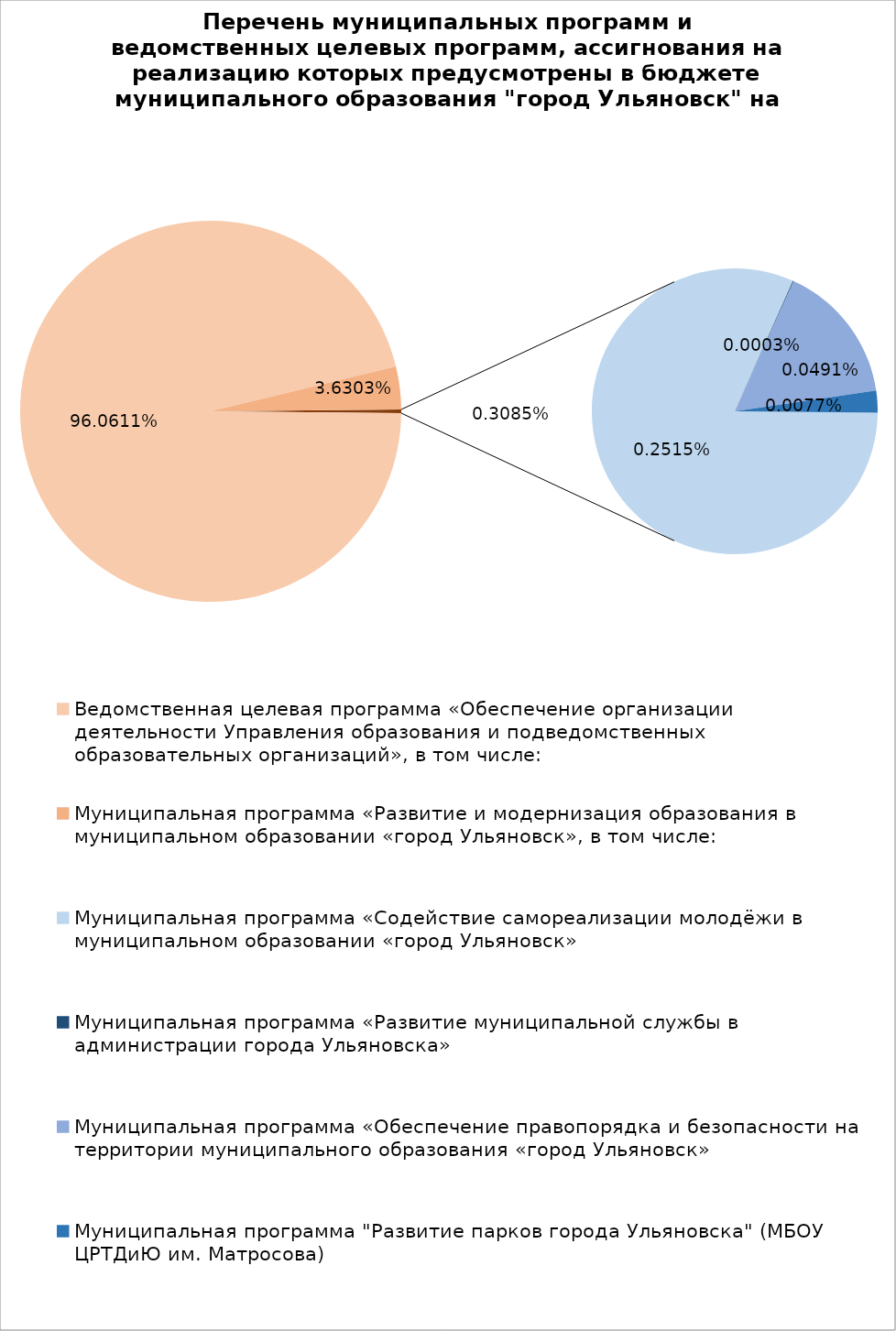
| Category | Series 0 |
|---|---|
| Ведомственная целевая программа «Обеспечение организации деятельности Управления образования и подведомственных образовательных организаций», в том числе: | 5021524.36 |
| Муниципальная программа «Развитие и модернизация образования в муниципальном образовании «город Ульяновск», в том числе: | 189772.7 |
| Муниципальная программа «Содействие самореализации молодёжи в муниципальном образовании «город Ульяновск» | 13148.32 |
| Муниципальная программа «Развитие муниципальной службы в администрации города Ульяновска» | 15.4 |
| Муниципальная программа «Обеспечение правопорядка и безопасности на территории муниципального образования «город Ульяновск» | 2565 |
| Муниципальная программа "Развитие парков города Ульяновска" (МБОУ ЦРТДиЮ им. Матросова) | 400 |